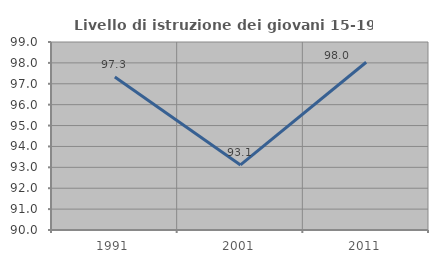
| Category | Livello di istruzione dei giovani 15-19 anni |
|---|---|
| 1991.0 | 97.324 |
| 2001.0 | 93.114 |
| 2011.0 | 98.031 |